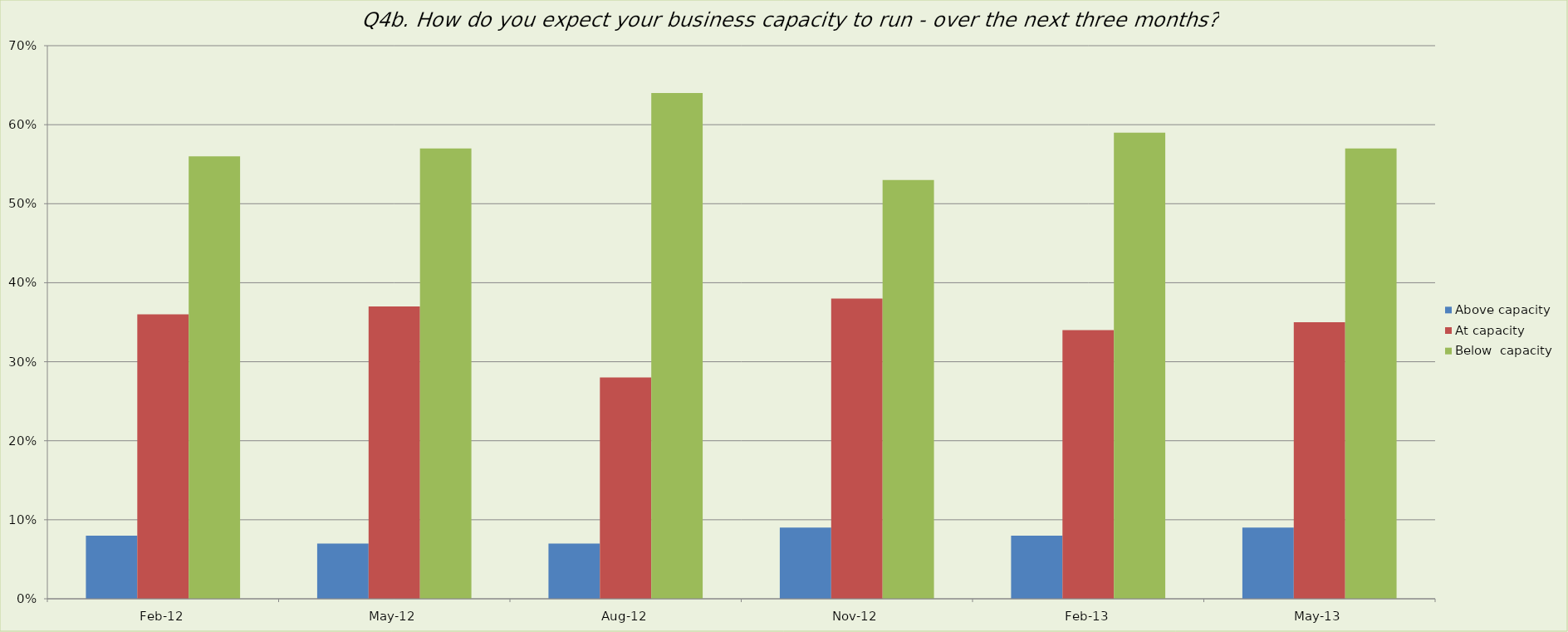
| Category | Above capacity | At capacity | Below  capacity |
|---|---|---|---|
| 2012-02-01 | 0.08 | 0.36 | 0.56 |
| 2012-05-01 | 0.07 | 0.37 | 0.57 |
| 2012-08-01 | 0.07 | 0.28 | 0.64 |
| 2012-11-01 | 0.09 | 0.38 | 0.53 |
| 2013-02-01 | 0.08 | 0.34 | 0.59 |
| 2013-05-01 | 0.09 | 0.35 | 0.57 |